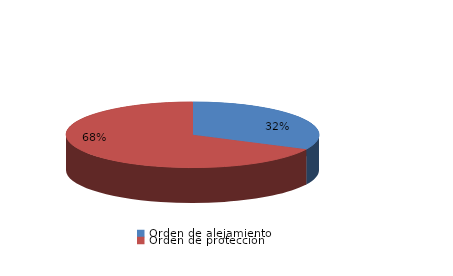
| Category | Series 0 |
|---|---|
| Orden de alejamiento | 58 |
| Orden de protección | 122 |